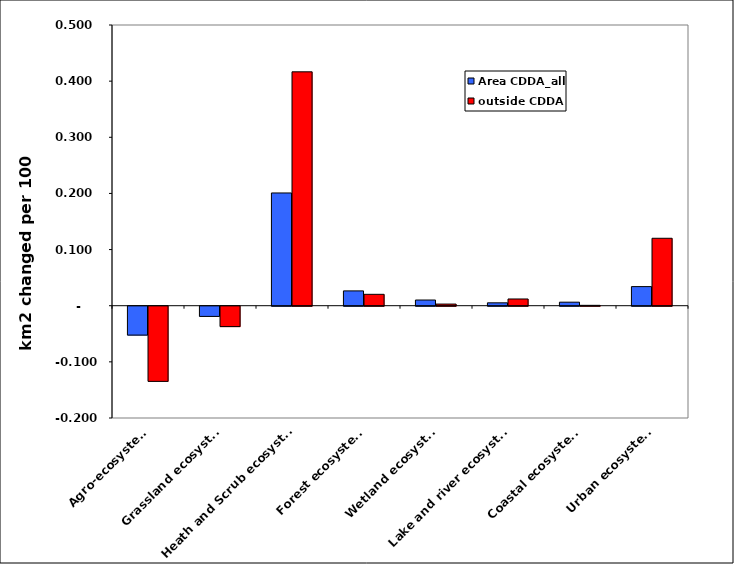
| Category | Area CDDA_all | outside CDDA |
|---|---|---|
| Agro-ecosystems | -0.051 | -0.134 |
| Grassland ecosystems | -0.018 | -0.036 |
| Heath and Scrub ecosystems | 0.201 | 0.417 |
| Forest ecosystems | 0.026 | 0.02 |
| Wetland ecosystems | 0.01 | 0.003 |
| Lake and river ecosystems | 0.005 | 0.012 |
| Coastal ecosystems | 0.006 | 0.001 |
| Urban ecosystems | 0.034 | 0.12 |